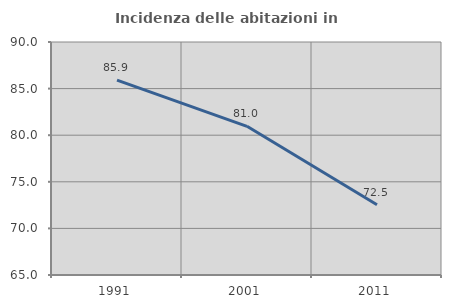
| Category | Incidenza delle abitazioni in proprietà  |
|---|---|
| 1991.0 | 85.909 |
| 2001.0 | 80.952 |
| 2011.0 | 72.542 |